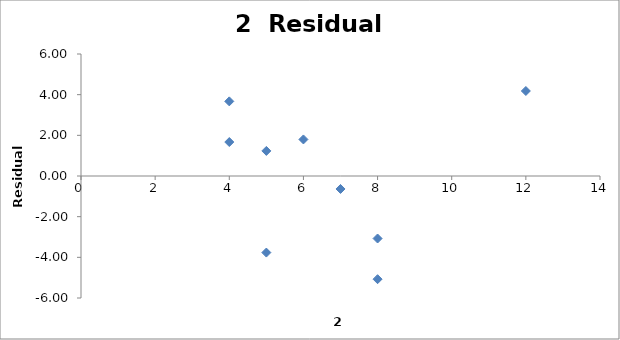
| Category | Series 0 |
|---|---|
| 4.0 | 1.67 |
| 4.0 | 3.67 |
| 5.0 | 1.234 |
| 5.0 | -3.766 |
| 6.0 | 1.798 |
| 7.0 | -0.638 |
| 8.0 | -5.074 |
| 8.0 | -3.074 |
| 12.0 | 4.181 |